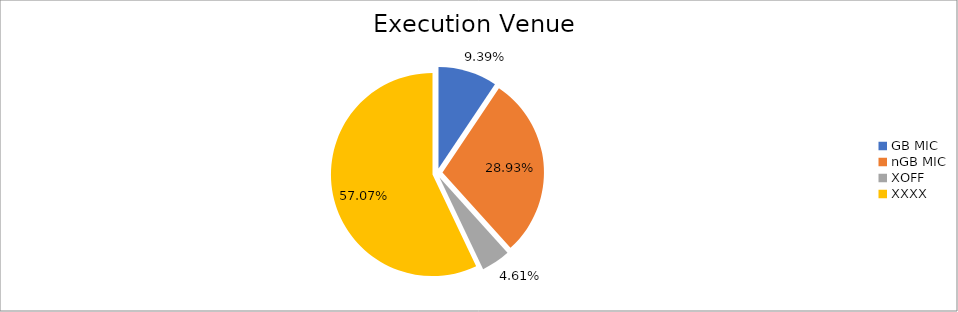
| Category | Series 0 |
|---|---|
| GB MIC | 983988.919 |
| nGB MIC | 3032948.07 |
| XOFF | 482781.582 |
| XXXX | 5983001.954 |